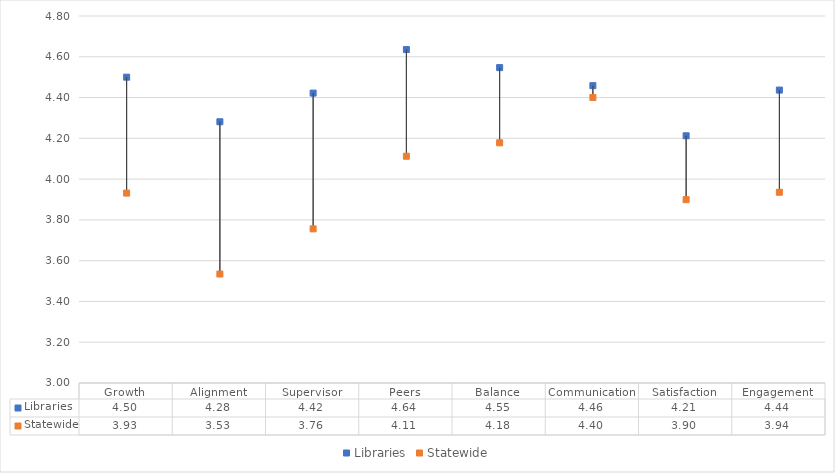
| Category | Libraries | Statewide |
|---|---|---|
| Growth | 4.5 | 3.931 |
| Alignment | 4.281 | 3.534 |
| Supervisor | 4.422 | 3.756 |
| Peers | 4.635 | 4.112 |
| Balance | 4.547 | 4.178 |
| Communication | 4.458 | 4.4 |
| Satisfaction | 4.212 | 3.899 |
| Engagement | 4.437 | 3.936 |